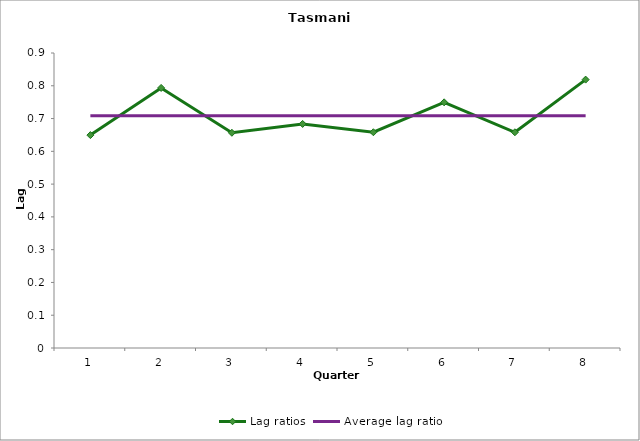
| Category | Lag ratios | Average lag ratio |
|---|---|---|
| 0 | 0.649 | 0.708 |
| 1 | 0.793 | 0.708 |
| 2 | 0.657 | 0.708 |
| 3 | 0.684 | 0.708 |
| 4 | 0.658 | 0.708 |
| 5 | 0.749 | 0.708 |
| 6 | 0.658 | 0.708 |
| 7 | 0.819 | 0.708 |